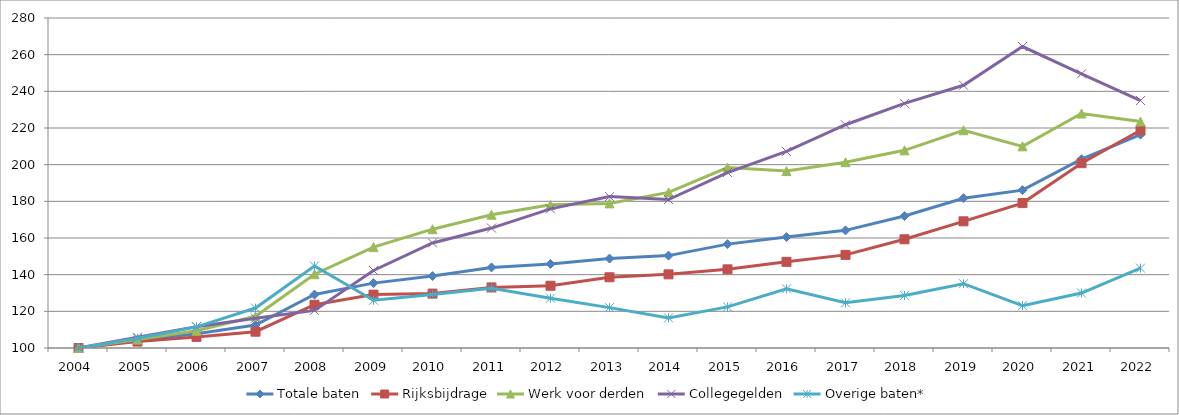
| Category | Totale baten | Rijksbijdrage | Werk voor derden | Collegegelden | Overige baten* |
|---|---|---|---|---|---|
| 2004.0 | 100 | 100 | 100 | 100 | 100 |
| 2005.0 | 104.092 | 103.499 | 104.629 | 105.881 | 105.274 |
| 2006.0 | 107.725 | 106.046 | 109.4 | 111.65 | 111.532 |
| 2007.0 | 112.54 | 108.881 | 117.297 | 116.238 | 121.792 |
| 2008.0 | 129.159 | 123.607 | 140.241 | 120.507 | 144.7 |
| 2009.0 | 135.394 | 129.117 | 155.052 | 142.268 | 126.04 |
| 2010.0 | 139.236 | 129.673 | 164.812 | 157.305 | 129.194 |
| 2011.0 | 143.936 | 133.048 | 172.718 | 165.412 | 132.613 |
| 2012.0 | 145.837 | 133.95 | 178.088 | 175.878 | 127.131 |
| 2013.0 | 148.786 | 138.576 | 178.882 | 182.576 | 122.028 |
| 2014.0 | 150.389 | 140.17 | 184.857 | 180.975 | 116.442 |
| 2015.0 | 156.657 | 142.9 | 198.435 | 195.707 | 122.426 |
| 2016.0 | 160.529 | 146.987 | 196.5 | 207.207 | 132.276 |
| 2017.0 | 164.164 | 150.797 | 201.356 | 221.776 | 124.656 |
| 2018.0 | 171.97 | 159.3 | 207.813 | 233.423 | 128.682 |
| 2019.0 | 181.715 | 169.102 | 218.77 | 243.315 | 135.073 |
| 2020.0 | 186.11 | 179.038 | 209.981 | 264.447 | 123.084 |
| 2021.0 | 202.971 | 200.812 | 227.875 | 249.578 | 129.992 |
| 2022.0 | 216.392 | 218.755 | 223.558 | 234.982 | 143.563 |